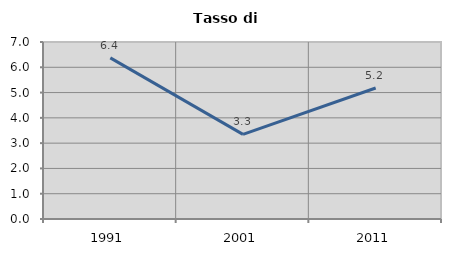
| Category | Tasso di disoccupazione   |
|---|---|
| 1991.0 | 6.371 |
| 2001.0 | 3.348 |
| 2011.0 | 5.182 |